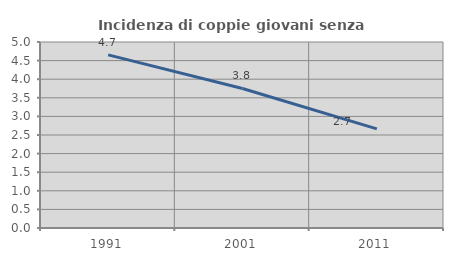
| Category | Incidenza di coppie giovani senza figli |
|---|---|
| 1991.0 | 4.653 |
| 2001.0 | 3.752 |
| 2011.0 | 2.665 |